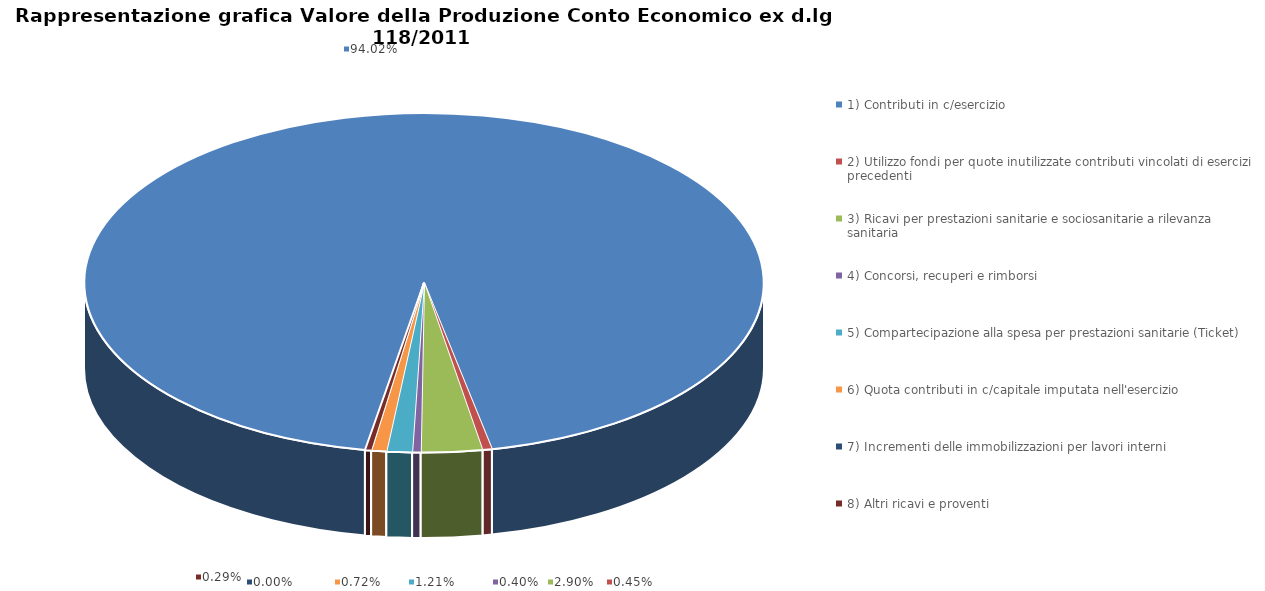
| Category | Series 0 |
|---|---|
| 1) Contributi in c/esercizio | 0.94 |
| 2) Utilizzo fondi per quote inutilizzate contributi vincolati di esercizi precedenti | 0.005 |
| 3) Ricavi per prestazioni sanitarie e sociosanitarie a rilevanza sanitaria | 0.029 |
| 4) Concorsi, recuperi e rimborsi | 0.004 |
| 5) Compartecipazione alla spesa per prestazioni sanitarie (Ticket) | 0.012 |
| 6) Quota contributi in c/capitale imputata nell'esercizio | 0.007 |
| 7) Incrementi delle immobilizzazioni per lavori interni | 0 |
| 8) Altri ricavi e proventi | 0.003 |